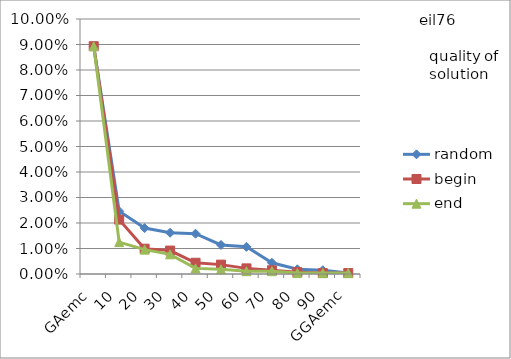
| Category | random | begin | end |
|---|---|---|---|
| 0 | 0.089 | 0.089 | 0.089 |
| 1 | 0.025 | 0.021 | 0.012 |
| 2 | 0.018 | 0.01 | 0.01 |
| 3 | 0.016 | 0.009 | 0.008 |
| 4 | 0.016 | 0.004 | 0.002 |
| 5 | 0.011 | 0.004 | 0.002 |
| 6 | 0.011 | 0.002 | 0.001 |
| 7 | 0.004 | 0.001 | 0.001 |
| 8 | 0.002 | 0.001 | 0 |
| 9 | 0.001 | 0 | 0 |
| 10 | 0 | 0 | 0 |